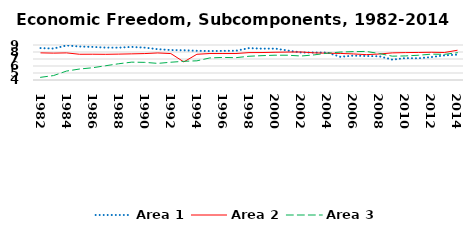
| Category | Area 1 | Area 2 | Area 3 |
|---|---|---|---|
| 1982.0 | 8.56 | 7.875 | 4.382 |
| 1983.0 | 8.492 | 7.837 | 4.633 |
| 1984.0 | 8.938 | 7.873 | 5.277 |
| 1985.0 | 8.781 | 7.675 | 5.569 |
| 1986.0 | 8.724 | 7.683 | 5.748 |
| 1987.0 | 8.628 | 7.669 | 6.04 |
| 1988.0 | 8.625 | 7.697 | 6.321 |
| 1989.0 | 8.726 | 7.735 | 6.549 |
| 1990.0 | 8.623 | 7.775 | 6.519 |
| 1991.0 | 8.402 | 7.865 | 6.373 |
| 1992.0 | 8.279 | 7.775 | 6.539 |
| 1993.0 | 8.246 | 6.587 | 6.672 |
| 1994.0 | 8.173 | 7.676 | 6.741 |
| 1995.0 | 8.138 | 7.782 | 7.155 |
| 1996.0 | 8.165 | 7.78 | 7.222 |
| 1997.0 | 8.18 | 7.781 | 7.19 |
| 1998.0 | 8.555 | 7.912 | 7.391 |
| 1999.0 | 8.478 | 7.924 | 7.481 |
| 2000.0 | 8.487 | 7.963 | 7.54 |
| 2001.0 | 8.207 | 7.993 | 7.539 |
| 2002.0 | 7.927 | 8.003 | 7.427 |
| 2003.0 | 7.926 | 7.876 | 7.588 |
| 2004.0 | 7.925 | 7.827 | 7.83 |
| 2005.0 | 7.318 | 7.795 | 7.991 |
| 2006.0 | 7.478 | 7.726 | 8.056 |
| 2007.0 | 7.431 | 7.623 | 8.083 |
| 2008.0 | 7.387 | 7.712 | 7.78 |
| 2009.0 | 6.911 | 7.875 | 7.402 |
| 2010.0 | 7.126 | 7.914 | 7.44 |
| 2011.0 | 7.103 | 7.933 | 7.535 |
| 2012.0 | 7.279 | 7.963 | 7.693 |
| 2013.0 | 7.521 | 7.929 | 7.666 |
| 2014.0 | 7.623 | 8.253 | 7.901 |